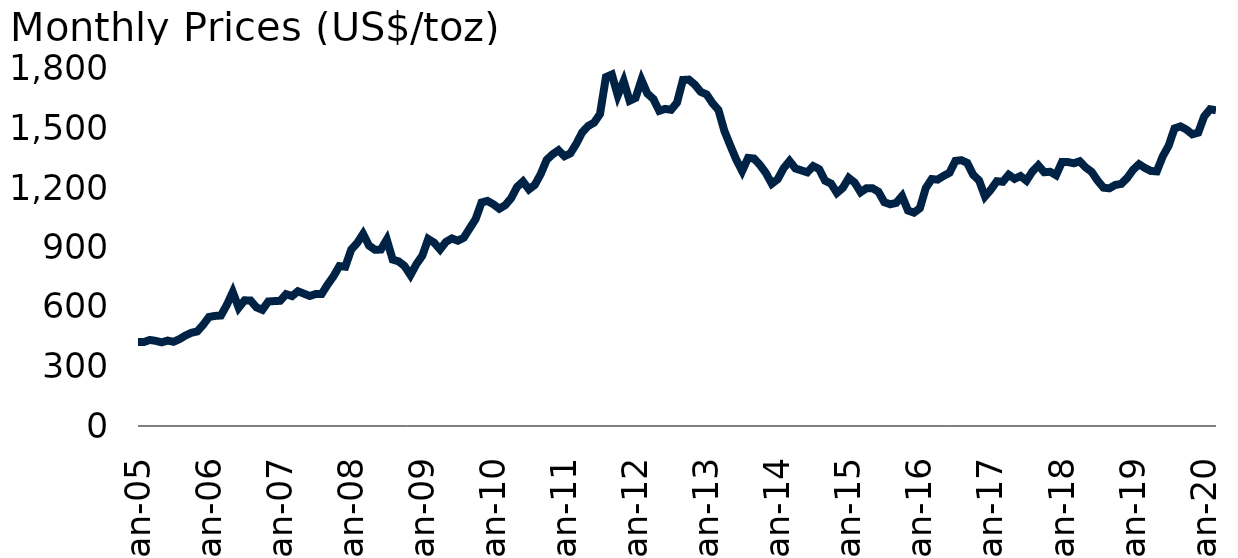
| Category | Gold |
|---|---|
| 2005-01-01 | 424.03 |
| 2005-02-01 | 423.35 |
| 2005-03-01 | 433.85 |
| 2005-04-01 | 429.233 |
| 2005-05-01 | 421.873 |
| 2005-06-01 | 430.657 |
| 2005-07-01 | 424.479 |
| 2005-08-01 | 437.93 |
| 2005-09-01 | 456.048 |
| 2005-10-01 | 469.898 |
| 2005-11-01 | 476.666 |
| 2005-12-01 | 510.097 |
| 2006-01-01 | 549.864 |
| 2006-02-01 | 554.995 |
| 2006-03-01 | 557.093 |
| 2006-04-01 | 610.653 |
| 2006-05-01 | 675.393 |
| 2006-06-01 | 596.145 |
| 2006-07-01 | 633.71 |
| 2006-08-01 | 632.593 |
| 2006-09-01 | 598.186 |
| 2006-10-01 | 585.78 |
| 2006-11-01 | 627.827 |
| 2006-12-01 | 629.791 |
| 2007-01-01 | 631.166 |
| 2007-02-01 | 664.745 |
| 2007-03-01 | 654.895 |
| 2007-04-01 | 679.368 |
| 2007-05-01 | 667.31 |
| 2007-06-01 | 655.66 |
| 2007-07-01 | 665.38 |
| 2007-08-01 | 665.411 |
| 2007-09-01 | 712.653 |
| 2007-10-01 | 754.604 |
| 2007-11-01 | 806.248 |
| 2007-12-01 | 803.203 |
| 2008-01-01 | 889.595 |
| 2008-02-01 | 922.298 |
| 2008-03-01 | 968.434 |
| 2008-04-01 | 909.705 |
| 2008-05-01 | 888.663 |
| 2008-06-01 | 889.488 |
| 2008-07-01 | 939.772 |
| 2008-08-01 | 839.025 |
| 2008-09-01 | 829.932 |
| 2008-10-01 | 806.62 |
| 2008-11-01 | 760.863 |
| 2008-12-01 | 816.092 |
| 2009-01-01 | 858.69 |
| 2009-02-01 | 943 |
| 2009-03-01 | 924.273 |
| 2009-04-01 | 890.2 |
| 2009-05-01 | 928.645 |
| 2009-06-01 | 945.67 |
| 2009-07-01 | 934.228 |
| 2009-08-01 | 949.375 |
| 2009-09-01 | 996.591 |
| 2009-10-01 | 1043.159 |
| 2009-11-01 | 1127.036 |
| 2009-12-01 | 1134.724 |
| 2010-01-01 | 1117.963 |
| 2010-02-01 | 1095.413 |
| 2010-03-01 | 1113.337 |
| 2010-04-01 | 1148.688 |
| 2010-05-01 | 1205.434 |
| 2010-06-01 | 1232.92 |
| 2010-07-01 | 1192.966 |
| 2010-08-01 | 1215.81 |
| 2010-09-01 | 1270.977 |
| 2010-10-01 | 1342.024 |
| 2010-11-01 | 1369.886 |
| 2010-12-01 | 1390.553 |
| 2011-01-01 | 1360.46 |
| 2011-02-01 | 1374.68 |
| 2011-03-01 | 1423.26 |
| 2011-04-01 | 1480.89 |
| 2011-05-01 | 1512.58 |
| 2011-06-01 | 1529.36 |
| 2011-07-01 | 1572.75 |
| 2011-08-01 | 1759.01 |
| 2011-09-01 | 1772.14 |
| 2011-10-01 | 1666.43 |
| 2011-11-01 | 1739 |
| 2011-12-01 | 1639.97 |
| 2012-01-01 | 1654.05 |
| 2012-02-01 | 1744.82 |
| 2012-03-01 | 1675.95 |
| 2012-04-01 | 1649.2 |
| 2012-05-01 | 1589.04 |
| 2012-06-01 | 1598.76 |
| 2012-07-01 | 1594.29 |
| 2012-08-01 | 1630.31 |
| 2012-09-01 | 1744.81 |
| 2012-10-01 | 1746.58 |
| 2012-11-01 | 1721.64 |
| 2012-12-01 | 1684.762 |
| 2013-01-01 | 1671.848 |
| 2013-02-01 | 1627.57 |
| 2013-03-01 | 1593.086 |
| 2013-04-01 | 1487.857 |
| 2013-05-01 | 1414.027 |
| 2013-06-01 | 1343.35 |
| 2013-07-01 | 1285.516 |
| 2013-08-01 | 1351.742 |
| 2013-09-01 | 1348.6 |
| 2013-10-01 | 1316.58 |
| 2013-11-01 | 1275.86 |
| 2013-12-01 | 1221.512 |
| 2014-01-01 | 1244.27 |
| 2014-02-01 | 1299.58 |
| 2014-03-01 | 1336.08 |
| 2014-04-01 | 1298.45 |
| 2014-05-01 | 1288.74 |
| 2014-06-01 | 1279.1 |
| 2014-07-01 | 1310.59 |
| 2014-08-01 | 1295.13 |
| 2014-09-01 | 1236.55 |
| 2014-10-01 | 1222.49 |
| 2014-11-01 | 1175.33 |
| 2014-12-01 | 1200.62 |
| 2015-01-01 | 1250.75 |
| 2015-02-01 | 1227.08 |
| 2015-03-01 | 1178.63 |
| 2015-04-01 | 1198.93 |
| 2015-05-01 | 1198.63 |
| 2015-06-01 | 1181.5 |
| 2015-07-01 | 1128.31 |
| 2015-08-01 | 1117.93 |
| 2015-09-01 | 1124.77 |
| 2015-10-01 | 1159.25 |
| 2015-11-01 | 1086.44 |
| 2015-12-01 | 1075.74 |
| 2016-01-01 | 1097.91 |
| 2016-02-01 | 1199.5 |
| 2016-03-01 | 1245.14 |
| 2016-04-01 | 1242.26 |
| 2016-05-01 | 1260.95 |
| 2016-06-01 | 1276.4 |
| 2016-07-01 | 1336.66 |
| 2016-08-01 | 1340.17 |
| 2016-09-01 | 1326.61 |
| 2016-10-01 | 1266.55 |
| 2016-11-01 | 1238.35 |
| 2016-12-01 | 1157.36 |
| 2017-01-01 | 1192.1 |
| 2017-02-01 | 1234.2 |
| 2017-03-01 | 1231.42 |
| 2017-04-01 | 1266.88 |
| 2017-05-01 | 1246.04 |
| 2017-06-01 | 1260.26 |
| 2017-07-01 | 1236.84 |
| 2017-08-01 | 1283.04 |
| 2017-09-01 | 1314.07 |
| 2017-10-01 | 1279.51 |
| 2017-11-01 | 1281.9 |
| 2017-12-01 | 1264.45 |
| 2018-01-01 | 1331.3 |
| 2018-02-01 | 1330.73 |
| 2018-03-01 | 1324.66 |
| 2018-04-01 | 1334.76 |
| 2018-05-01 | 1303.45 |
| 2018-06-01 | 1281.57 |
| 2018-07-01 | 1237.71 |
| 2018-08-01 | 1201.71 |
| 2018-09-01 | 1198.39 |
| 2018-10-01 | 1215.39 |
| 2018-11-01 | 1220.65 |
| 2018-12-01 | 1250.4 |
| 2019-01-01 | 1291.75 |
| 2019-02-01 | 1320.07 |
| 2019-03-01 | 1300.9 |
| 2019-04-01 | 1285.91 |
| 2019-05-01 | 1283.7 |
| 2019-06-01 | 1359.04 |
| 2019-07-01 | 1412.89 |
| 2019-08-01 | 1500.41 |
| 2019-09-01 | 1510.58 |
| 2019-10-01 | 1494.81 |
| 2019-11-01 | 1470.79 |
| 2019-12-01 | 1479.13 |
| 2020-01-01 | 1560.67 |
| 2020-02-01 | 1597.1 |
| 2020-03-01 | 1591.93 |